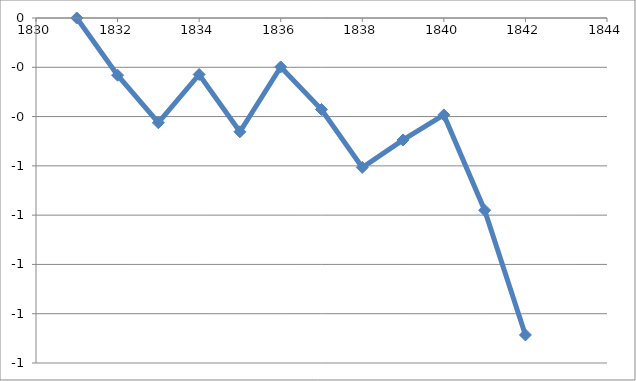
| Category | Series 0 |
|---|---|
| 1831.0 | 0 |
| 1832.0 | -0.232 |
| 1833.0 | -0.425 |
| 1834.0 | -0.229 |
| 1835.0 | -0.462 |
| 1836.0 | -0.199 |
| 1837.0 | -0.371 |
| 1838.0 | -0.606 |
| 1839.0 | -0.495 |
| 1840.0 | -0.393 |
| 1841.0 | -0.78 |
| 1842.0 | -1.286 |